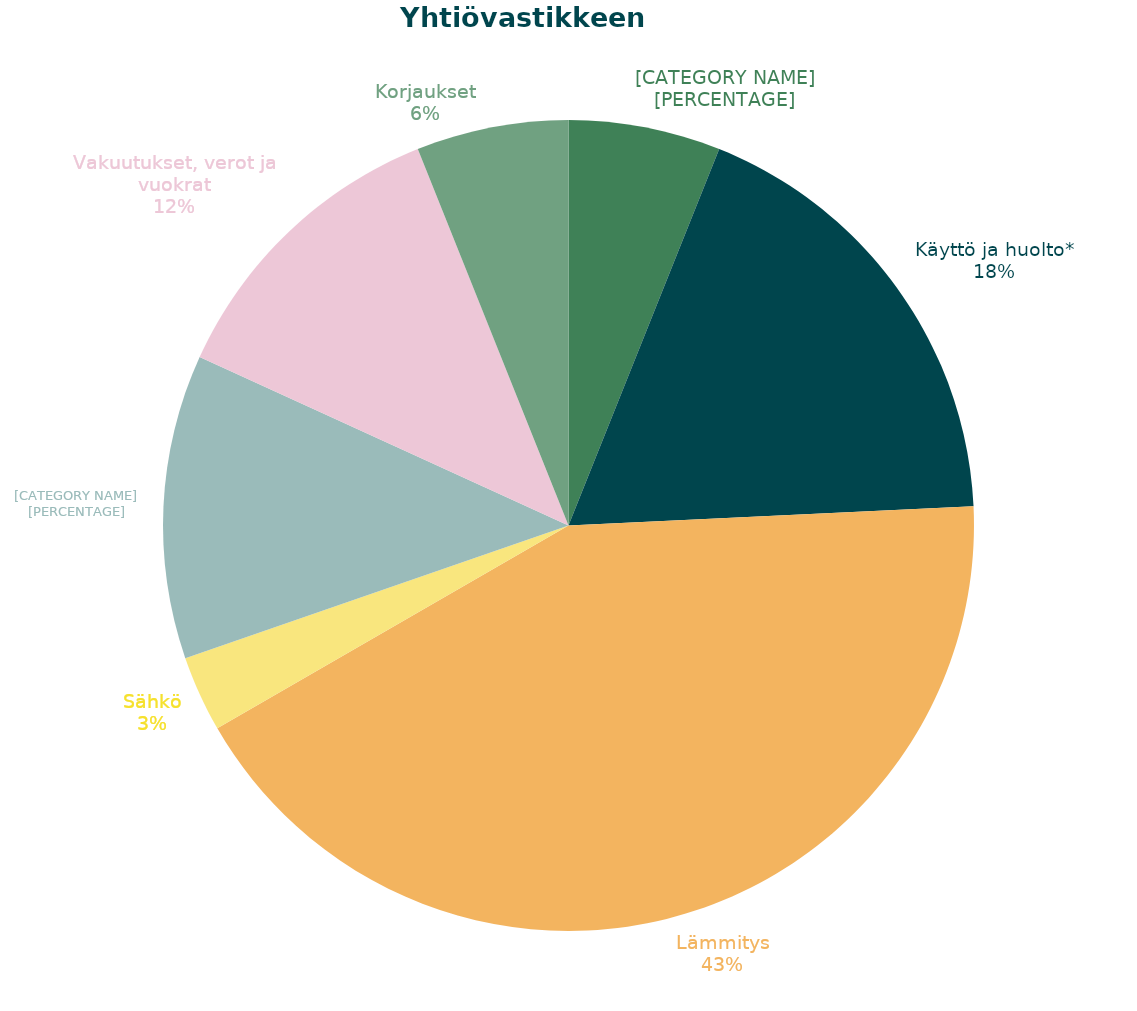
| Category | Series 0 |
|---|---|
| Hallinto ja henkilöstö | 1000 |
| Käyttö ja huolto* | 3000 |
| Lämmitys | 7000 |
| Sähkö | 500 |
| Vesi ja jätevesi | 2000 |
| Vakuutukset, verot ja vuokrat | 2000 |
| Korjaukset | 1000 |